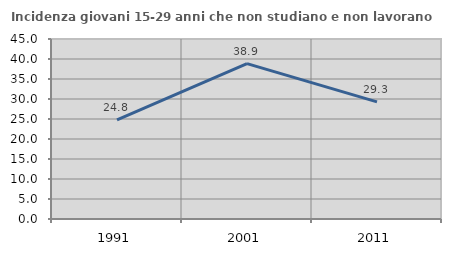
| Category | Incidenza giovani 15-29 anni che non studiano e non lavorano  |
|---|---|
| 1991.0 | 24.8 |
| 2001.0 | 38.854 |
| 2011.0 | 29.268 |